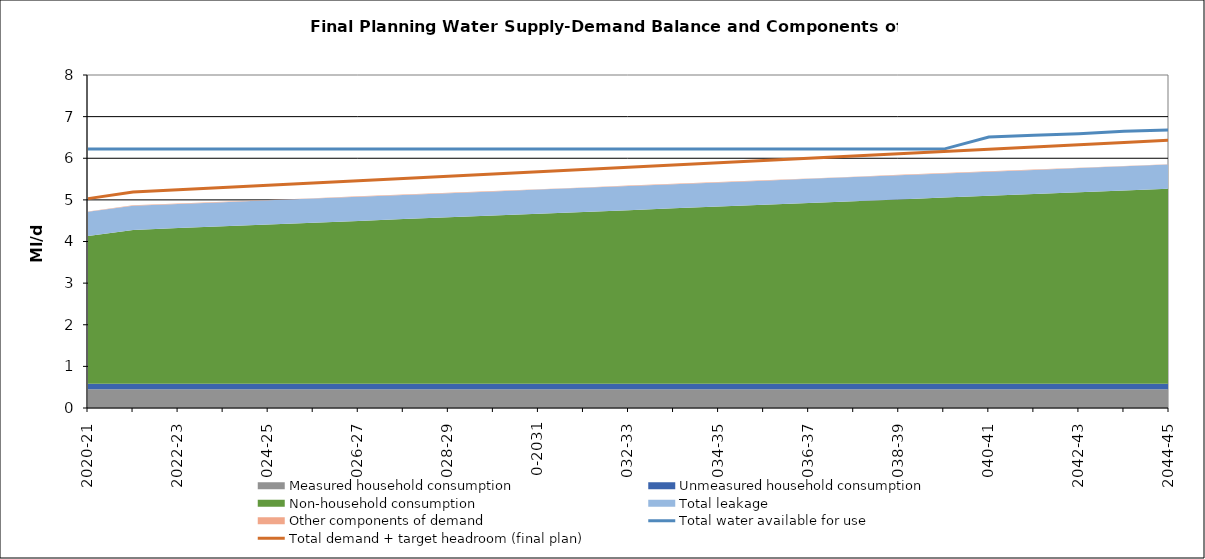
| Category | Total water available for use | Total demand + target headroom (final plan) |
|---|---|---|
| 0 | 6.22 | 5.03 |
| 1 | 6.22 | 5.188 |
| 2 | 6.22 | 5.242 |
| 3 | 6.22 | 5.296 |
| 4 | 6.22 | 5.35 |
| 5 | 6.22 | 5.404 |
| 6 | 6.22 | 5.458 |
| 7 | 6.22 | 5.512 |
| 8 | 6.22 | 5.567 |
| 9 | 6.22 | 5.621 |
| 10 | 6.22 | 5.675 |
| 11 | 6.22 | 5.729 |
| 12 | 6.22 | 5.783 |
| 13 | 6.22 | 5.837 |
| 14 | 6.22 | 5.891 |
| 15 | 6.22 | 5.945 |
| 16 | 6.22 | 5.999 |
| 17 | 6.22 | 6.053 |
| 18 | 6.22 | 6.107 |
| 19 | 6.22 | 6.161 |
| 20 | 6.51 | 6.215 |
| 21 | 6.55 | 6.27 |
| 22 | 6.59 | 6.324 |
| 23 | 6.65 | 6.378 |
| 24 | 6.68 | 6.432 |